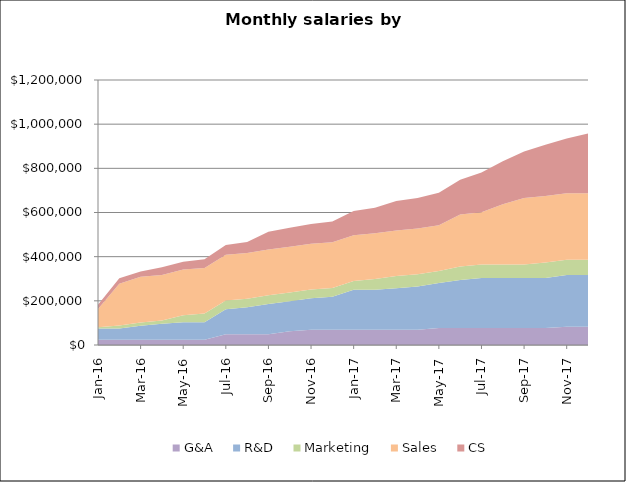
| Category | G&A | R&D | Marketing | Sales | CS |
|---|---|---|---|---|---|
| Jan-16 | 24000 | 50400 | 6000 | 83000 | 19200 |
| Feb-16 | 24000 | 50400 | 14400 | 189000 | 24000 |
| Mar-16 | 24000 | 63600 | 14400 | 207000 | 24000 |
| Apr-16 | 24000 | 72000 | 14400 | 207000 | 34800 |
| May-16 | 24000 | 78600 | 32400 | 207000 | 34800 |
| Jun-16 | 24000 | 78600 | 39600 | 207000 | 39600 |
| Jul-16 | 49200 | 112800 | 39600 | 207000 | 44400 |
| Aug-16 | 49200 | 121200 | 39600 | 207000 | 49200 |
| Sep-16 | 49200 | 136200 | 39600 | 207000 | 80400 |
| Oct-16 | 62400 | 136200 | 39600 | 207000 | 85200 |
| Nov-16 | 69000 | 142800 | 39600 | 207000 | 90000 |
| Dec-16 | 69000 | 149400 | 39600 | 207000 | 94800 |
| Jan-17 | 69000 | 181200 | 39600 | 207000 | 110400 |
| Feb-17 | 69000 | 181200 | 49200 | 207000 | 115200 |
| Mar-17 | 69000 | 187800 | 55200 | 207000 | 133200 |
| Apr-17 | 69000 | 196200 | 55200 | 207000 | 138000 |
| May-17 | 77400 | 202800 | 55200 | 207000 | 147600 |
| Jun-17 | 77400 | 216600 | 61200 | 236000 | 157200 |
| Jul-17 | 77400 | 226200 | 61200 | 236000 | 180000 |
| Aug-17 | 77400 | 226200 | 61200 | 272000 | 195600 |
| Sep-17 | 77400 | 226200 | 61200 | 301000 | 210000 |
| Oct-17 | 77400 | 226200 | 69600 | 301000 | 232800 |
| Nov-17 | 82200 | 234600 | 69600 | 301000 | 247200 |
| Dec-17 | 82200 | 234600 | 69600 | 301000 | 270000 |